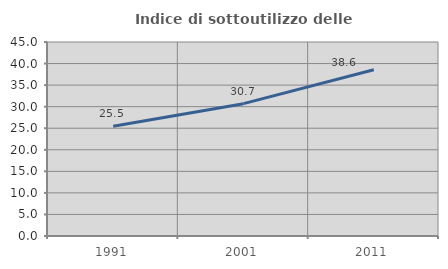
| Category | Indice di sottoutilizzo delle abitazioni  |
|---|---|
| 1991.0 | 25.457 |
| 2001.0 | 30.696 |
| 2011.0 | 38.558 |